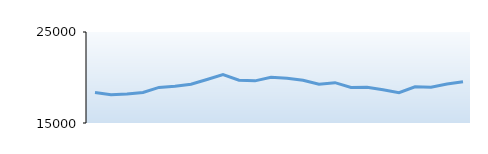
| Category | Anna Smith |
|---|---|
| 0 | 18341 |
| 1 | 18108 |
| 2 | 18176 |
| 3 | 18358 |
| 4 | 18909 |
| 5 | 19028 |
| 6 | 19259 |
| 7 | 19776 |
| 8 | 20312 |
| 9 | 19702 |
| 10 | 19632 |
| 11 | 20036 |
| 12 | 19917 |
| 13 | 19701 |
| 14 | 19272 |
| 15 | 19434 |
| 16 | 18911 |
| 17 | 18935 |
| 18 | 18658 |
| 19 | 18336 |
| 20 | 18984 |
| 21 | 18942 |
| 22 | 19293 |
| 23 | 19532 |